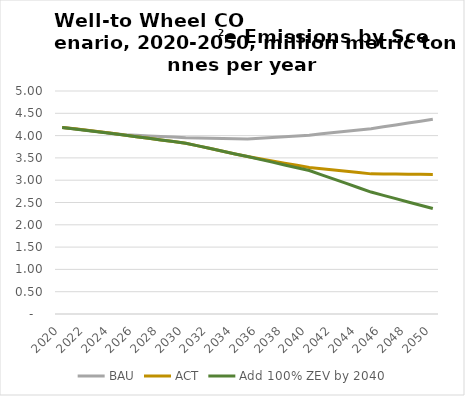
| Category | BAU | ACT | Add 100% ZEV by 2040 |
|---|---|---|---|
| 2020.0 | 4.184 | 4.184 | 4.184 |
| 2021.0 | 4.151 | 4.151 | 4.15 |
| 2022.0 | 4.118 | 4.118 | 4.115 |
| 2023.0 | 4.086 | 4.086 | 4.081 |
| 2024.0 | 4.053 | 4.053 | 4.047 |
| 2025.0 | 4.021 | 4.013 | 4.013 |
| 2026.0 | 4.007 | 3.976 | 3.976 |
| 2027.0 | 3.994 | 3.94 | 3.94 |
| 2028.0 | 3.98 | 3.903 | 3.903 |
| 2029.0 | 3.967 | 3.866 | 3.866 |
| 2030.0 | 3.953 | 3.829 | 3.829 |
| 2031.0 | 3.947 | 3.769 | 3.769 |
| 2032.0 | 3.941 | 3.709 | 3.709 |
| 2033.0 | 3.934 | 3.649 | 3.649 |
| 2034.0 | 3.928 | 3.589 | 3.589 |
| 2035.0 | 3.922 | 3.529 | 3.529 |
| 2036.0 | 3.939 | 3.481 | 3.467 |
| 2037.0 | 3.957 | 3.432 | 3.405 |
| 2038.0 | 3.975 | 3.383 | 3.342 |
| 2039.0 | 3.992 | 3.334 | 3.28 |
| 2040.0 | 4.01 | 3.285 | 3.218 |
| 2041.0 | 4.039 | 3.257 | 3.121 |
| 2042.0 | 4.068 | 3.228 | 3.024 |
| 2043.0 | 4.097 | 3.199 | 2.928 |
| 2044.0 | 4.126 | 3.171 | 2.831 |
| 2045.0 | 4.155 | 3.142 | 2.734 |
| 2046.0 | 4.197 | 3.139 | 2.66 |
| 2047.0 | 4.239 | 3.136 | 2.586 |
| 2048.0 | 4.282 | 3.133 | 2.512 |
| 2049.0 | 4.324 | 3.131 | 2.438 |
| 2050.0 | 4.366 | 3.128 | 2.364 |